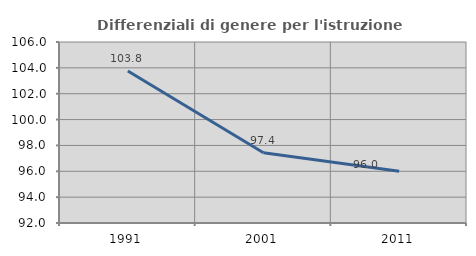
| Category | Differenziali di genere per l'istruzione superiore |
|---|---|
| 1991.0 | 103.751 |
| 2001.0 | 97.436 |
| 2011.0 | 95.997 |